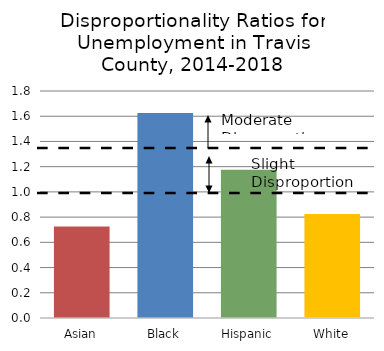
| Category | Series 0 |
|---|---|
| Asian | 0.725 |
| Black | 1.625 |
| Hispanic | 1.175 |
| White | 0.825 |